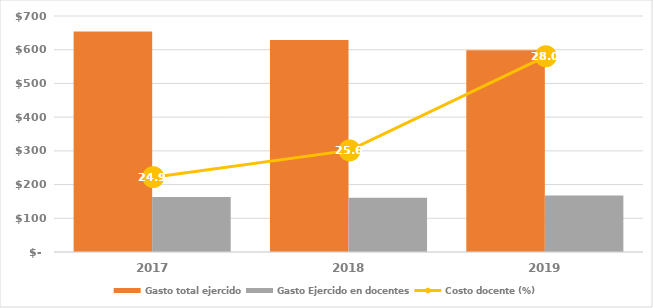
| Category | Gasto total ejercido | Gasto Ejercido en docentes |
|---|---|---|
| 2017.0 | 653670.792 | 162783.767 |
| 2018.0 | 628799.563 | 160863.176 |
| 2019.0 | 598040.902 | 167308.478 |